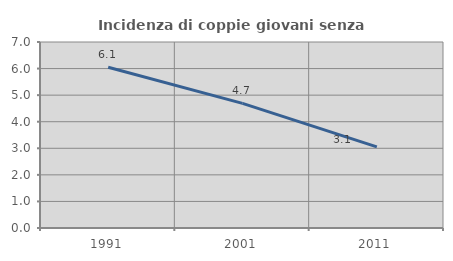
| Category | Incidenza di coppie giovani senza figli |
|---|---|
| 1991.0 | 6.051 |
| 2001.0 | 4.69 |
| 2011.0 | 3.055 |